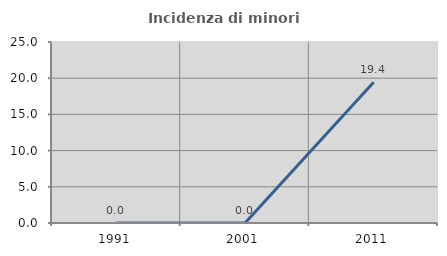
| Category | Incidenza di minori stranieri |
|---|---|
| 1991.0 | 0 |
| 2001.0 | 0 |
| 2011.0 | 19.444 |